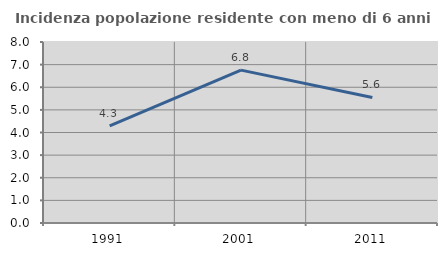
| Category | Incidenza popolazione residente con meno di 6 anni |
|---|---|
| 1991.0 | 4.295 |
| 2001.0 | 6.757 |
| 2011.0 | 5.55 |